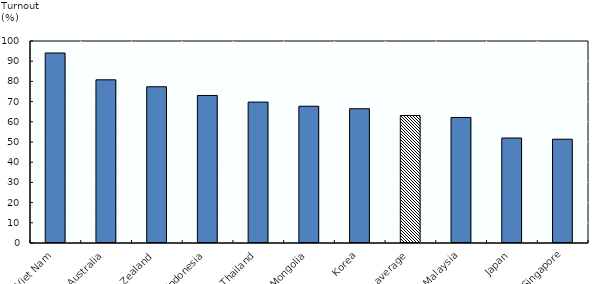
| Category | Series 1 |
|---|---|
| Viet Nam | 94.06 |
| Australia | 80.79 |
| New Zealand | 77.35 |
| Indonesia | 73.03 |
| Thailand | 69.75 |
| Mongolia | 67.71 |
| Korea | 66.48 |
| OECD average | 63.131 |
| Malaysia | 62.14 |
| Japan | 51.97 |
| Singapore | 51.37 |